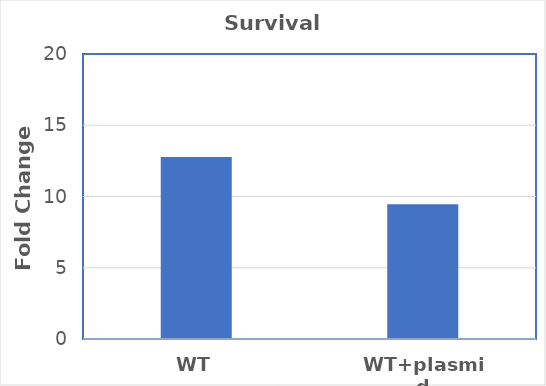
| Category | Series 0 |
|---|---|
| WT | 12.77 |
| WT+plasmid | 9.45 |